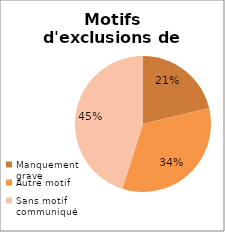
| Category | Series 0 |
|---|---|
| Manquement
grave | 41 |
| Autre motif | 65 |
| Sans motif communiqué | 87 |